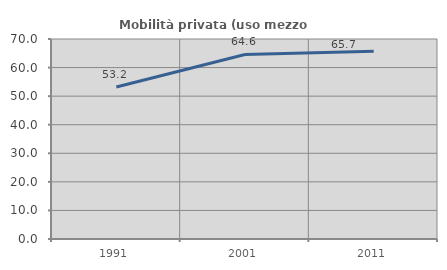
| Category | Mobilità privata (uso mezzo privato) |
|---|---|
| 1991.0 | 53.205 |
| 2001.0 | 64.582 |
| 2011.0 | 65.723 |